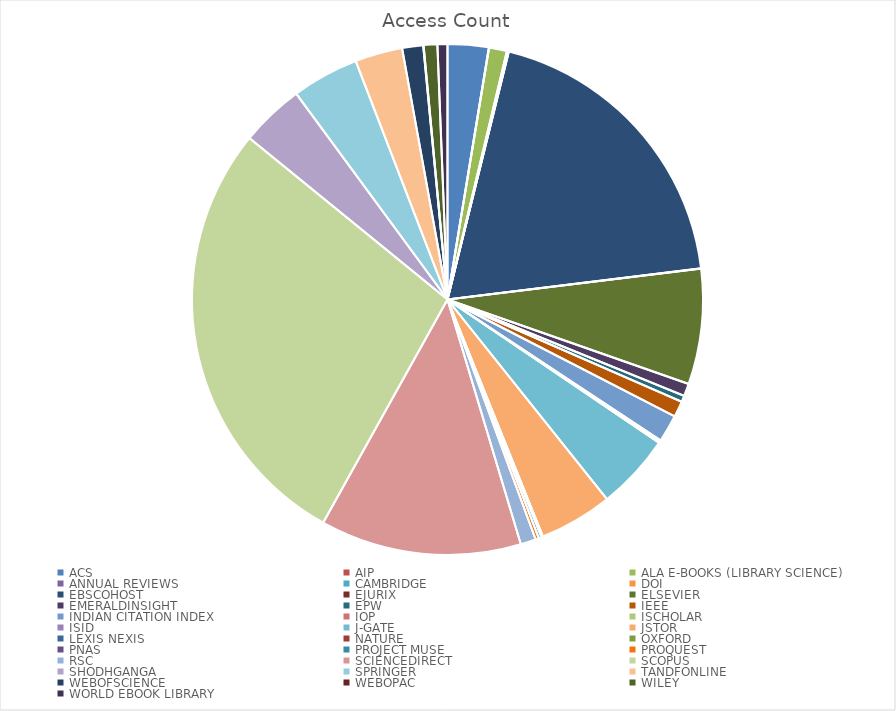
| Category | Access Count |
|---|---|
| ACS | 1132 |
| AIP | 7 |
| ALA E-BOOKS (LIBRARY SCIENCE) | 494 |
| ANNUAL REVIEWS | 38 |
| CAMBRIDGE | 10 |
| DOI | 6 |
| EBSCOHOST | 8389 |
| EJURIX | 5 |
| ELSEVIER | 3188 |
| EMERALDINSIGHT | 348 |
| EPW | 174 |
| IEEE | 438 |
| INDIAN CITATION INDEX | 761 |
| IOP | 52 |
| ISCHOLAR | 16 |
| ISID | 9 |
| J-GATE | 2098 |
| JSTOR | 2025 |
| LEXIS NEXIS | 4 |
| NATURE | 2 |
| OXFORD | 30 |
| PNAS | 6 |
| PROJECT MUSE | 78 |
| PROQUEST | 93 |
| RSC | 424 |
| SCIENCEDIRECT | 5560 |
| SCOPUS | 12146 |
| SHODHGANGA | 1763 |
| SPRINGER | 1853 |
| TANDFONLINE | 1311 |
| WEBOFSCIENCE | 580 |
| WEBOPAC | 11 |
| WILEY | 377 |
| WORLD EBOOK LIBRARY | 276 |